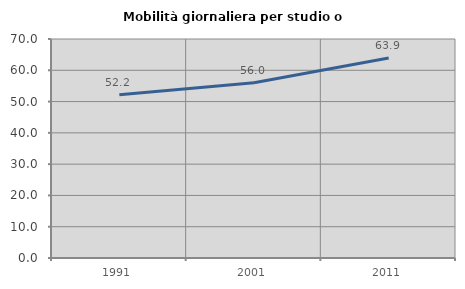
| Category | Mobilità giornaliera per studio o lavoro |
|---|---|
| 1991.0 | 52.196 |
| 2001.0 | 55.984 |
| 2011.0 | 63.899 |